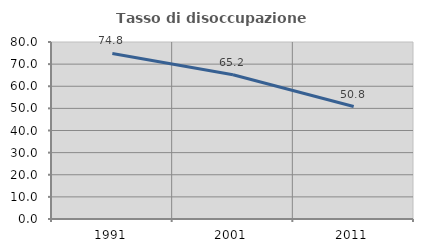
| Category | Tasso di disoccupazione giovanile  |
|---|---|
| 1991.0 | 74.809 |
| 2001.0 | 65.217 |
| 2011.0 | 50.847 |